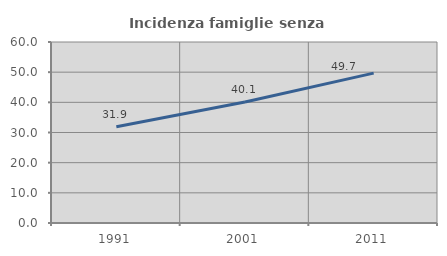
| Category | Incidenza famiglie senza nuclei |
|---|---|
| 1991.0 | 31.886 |
| 2001.0 | 40.112 |
| 2011.0 | 49.68 |